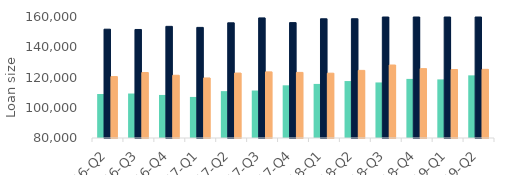
| Category | First-time
buyers | Homemovers | Homowner remortgaging |
|---|---|---|---|
| 16-Q2 | 109092.477 | 151940.615 | 120619.362 |
| 16-Q3 | 109404.381 | 151751.367 | 123299.102 |
| 16-Q4 | 108462.538 | 153819.799 | 121469.882 |
| 17-Q1 | 107143.478 | 153126.34 | 119697.041 |
| 17-Q2 | 110993.912 | 156159.89 | 122939.294 |
| 17-Q3 | 111392.176 | 159393.224 | 123718.651 |
| 17-Q4 | 114834.059 | 156298.601 | 123377.649 |
| 18-Q1 | 115756.887 | 158832.571 | 122851.857 |
| 18-Q2 | 117657.034 | 158852.144 | 124705.554 |
| 18-Q3 | 116729.299 | 160670.689 | 128255.82 |
| 18-Q4 | 119071.898 | 161127.925 | 125860.234 |
| 19-Q1 | 118742.165 | 162171.206 | 125292.555 |
| 19-Q2 | 121424.138 | 165114.156 | 125393.948 |